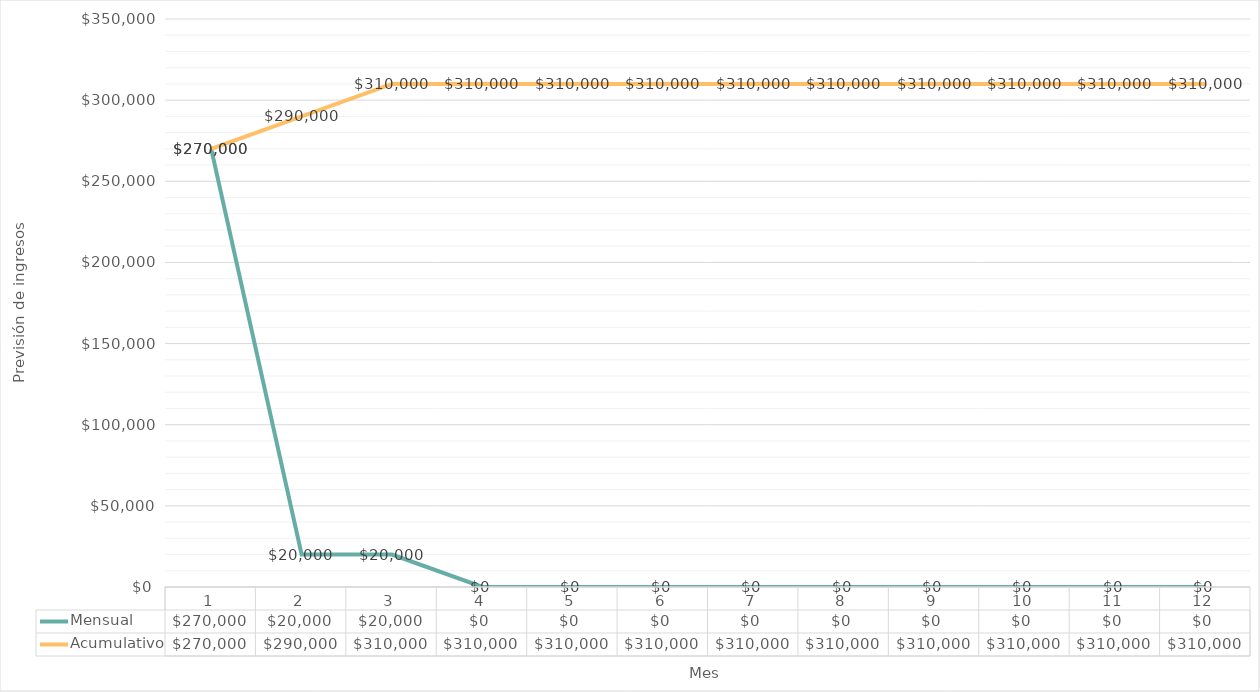
| Category | Mensual | Acumulativo |
|---|---|---|
| 0 | 270000 | 270000 |
| 1 | 20000 | 290000 |
| 2 | 20000 | 310000 |
| 3 | 0 | 310000 |
| 4 | 0 | 310000 |
| 5 | 0 | 310000 |
| 6 | 0 | 310000 |
| 7 | 0 | 310000 |
| 8 | 0 | 310000 |
| 9 | 0 | 310000 |
| 10 | 0 | 310000 |
| 11 | 0 | 310000 |